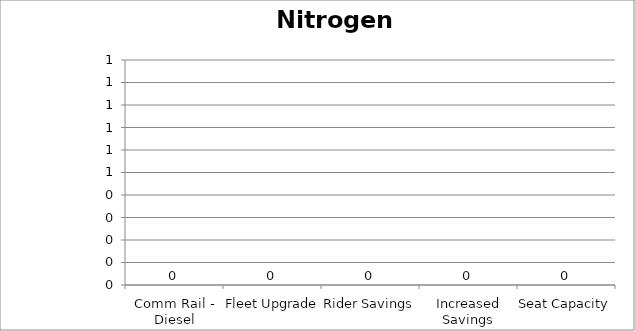
| Category | Nitrogen Oxides |
|---|---|
| Comm Rail - Diesel | 0 |
| Fleet Upgrade | 0 |
| Rider Savings | 0 |
| Increased Savings | 0 |
| Seat Capacity | 0 |